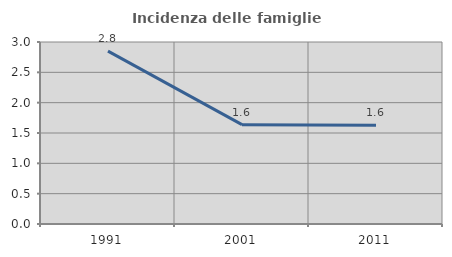
| Category | Incidenza delle famiglie numerose |
|---|---|
| 1991.0 | 2.849 |
| 2001.0 | 1.637 |
| 2011.0 | 1.629 |